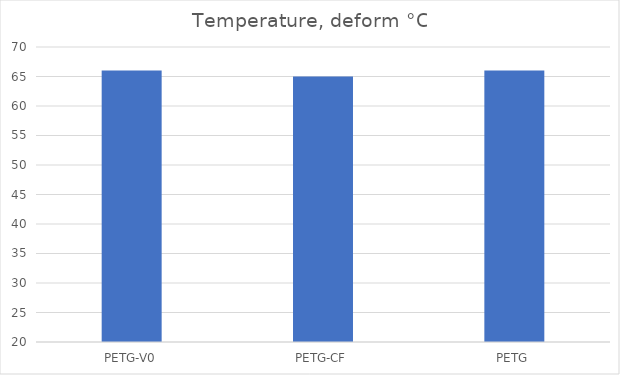
| Category | Deform °C |
|---|---|
| PETG-V0 | 66 |
| PETG-CF | 65 |
| PETG | 66 |